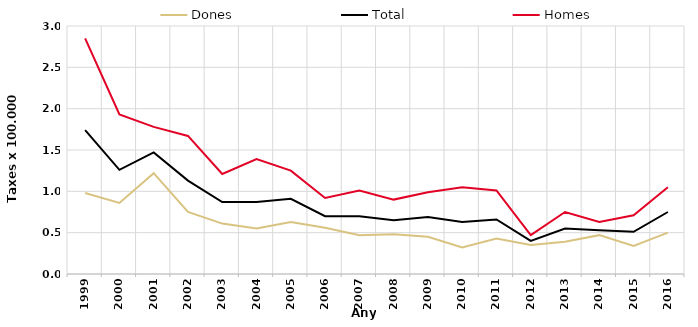
| Category | Dones | Total | Homes |
|---|---|---|---|
| 1999.0 | 0.98 | 1.74 | 2.85 |
| 2000.0 | 0.86 | 1.26 | 1.93 |
| 2001.0 | 1.22 | 1.47 | 1.78 |
| 2002.0 | 0.75 | 1.13 | 1.67 |
| 2003.0 | 0.61 | 0.87 | 1.21 |
| 2004.0 | 0.55 | 0.87 | 1.39 |
| 2005.0 | 0.63 | 0.91 | 1.25 |
| 2006.0 | 0.56 | 0.7 | 0.92 |
| 2007.0 | 0.47 | 0.7 | 1.01 |
| 2008.0 | 0.48 | 0.65 | 0.9 |
| 2009.0 | 0.45 | 0.69 | 0.99 |
| 2010.0 | 0.32 | 0.63 | 1.05 |
| 2011.0 | 0.43 | 0.66 | 1.01 |
| 2012.0 | 0.35 | 0.4 | 0.47 |
| 2013.0 | 0.39 | 0.55 | 0.75 |
| 2014.0 | 0.47 | 0.53 | 0.63 |
| 2015.0 | 0.34 | 0.51 | 0.71 |
| 2016.0 | 0.5 | 0.75 | 1.05 |